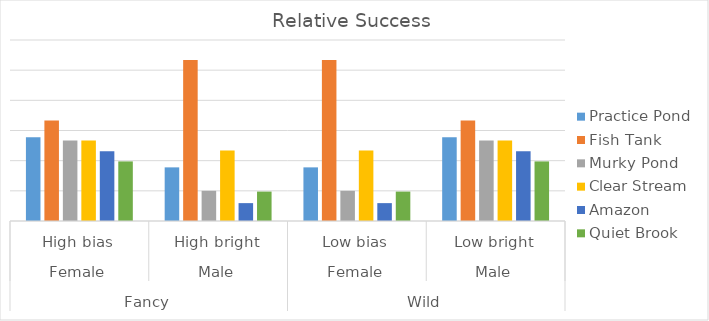
| Category | Practice Pond | Fish Tank | Murky Pond | Clear Stream | Amazon | Quiet Brook |
|---|---|---|---|---|---|---|
| 0 | 1.389 | 1.667 | 1.333 | 1.333 | 1.157 | 0.988 |
| 1 | 0.889 | 2.667 | 0.5 | 1.167 | 0.296 | 0.488 |
| 2 | 0.889 | 2.667 | 0.5 | 1.167 | 0.296 | 0.488 |
| 3 | 1.389 | 1.667 | 1.333 | 1.333 | 1.157 | 0.988 |